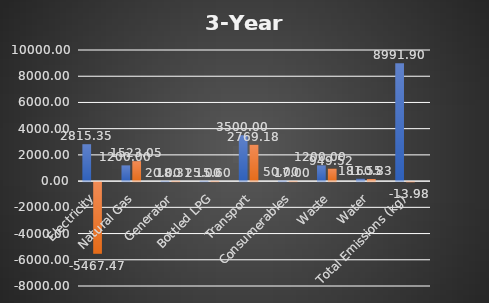
| Category | Series 0 | Series 1 | Series 2 |
|---|---|---|---|
| Electricity | 2815.35 | -5467.468 |  |
| Natural Gas | 1200 | 1523.053 |  |
| Generator | 20 | 18.31 |  |
| Bottled LPG | 25 | 15.6 |  |
| Transport | 3500 | 2769.18 |  |
| Consumerables | 50 | 17 |  |
| Waste | 1200 | 949.52 |  |
| Water | 181.55 | 160.826 |  |
| Total Emissions (kg) | 8991.9 | -13.979 |  |